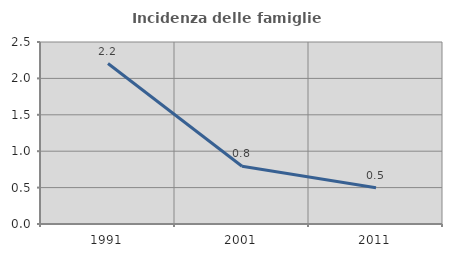
| Category | Incidenza delle famiglie numerose |
|---|---|
| 1991.0 | 2.204 |
| 2001.0 | 0.794 |
| 2011.0 | 0.499 |